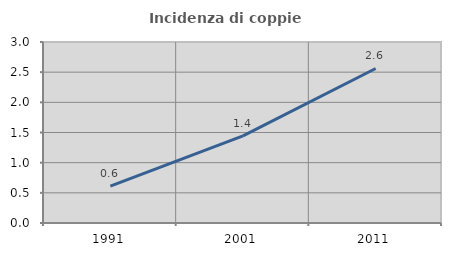
| Category | Incidenza di coppie miste |
|---|---|
| 1991.0 | 0.612 |
| 2001.0 | 1.445 |
| 2011.0 | 2.561 |